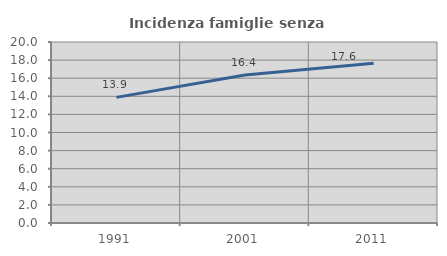
| Category | Incidenza famiglie senza nuclei |
|---|---|
| 1991.0 | 13.88 |
| 2001.0 | 16.351 |
| 2011.0 | 17.646 |